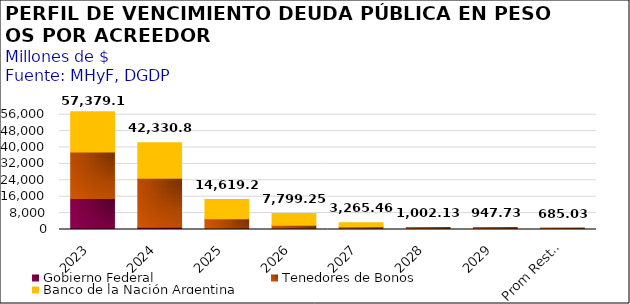
| Category | Gobierno Federal | Tenedores de Bonos | Banco de la Nación Argentina |
|---|---|---|---|
| 2023 | 15170.333 | 22662.24 | 19546.545 |
| 2024 | 1144.673 | 23825.718 | 17360.481 |
| 2025 | 263.201 | 5007.989 | 9348.049 |
| 2026 | 102.365 | 1947.963 | 5748.919 |
| 2027 | 55.878 | 1319.026 | 1890.558 |
| 2028 | 55.236 | 946.891 | 0 |
| 2029 | 55.169 | 892.557 | 0 |
| Prom Resto 2030-2050 | 52.897 | 632.131 | 0 |